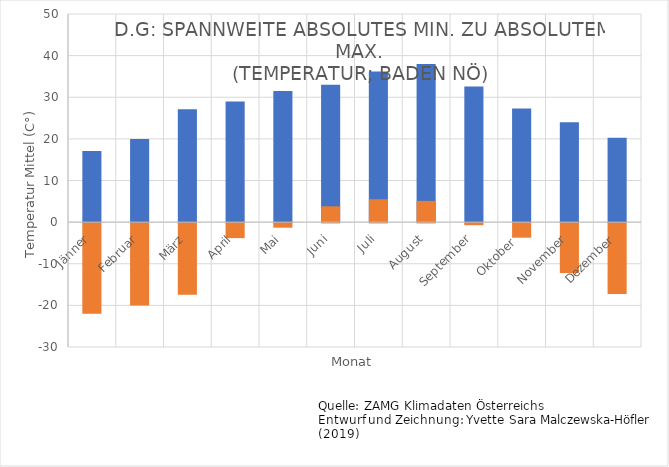
| Category | Temperatur Max. |
|---|---|
| Jänner | 17.1 |
| Februar | 20 |
| März | 27.1 |
| April | 29 |
| Mai | 31.5 |
| Juni | 33 |
| Juli | 36.2 |
| August | 38 |
| September | 32.6 |
| Oktober  | 27.3 |
| November | 24 |
| Dezember | 20.3 |